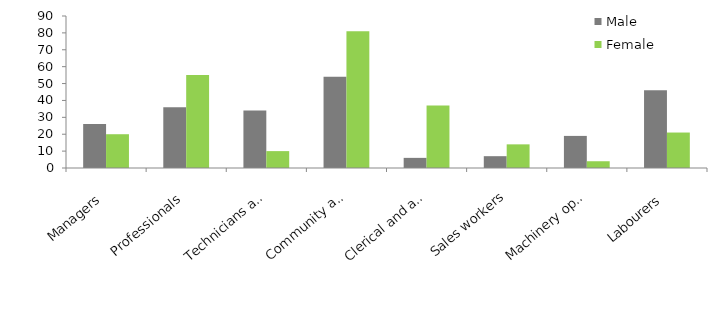
| Category | Male | Female |
|---|---|---|
| Managers | 26 | 20 |
| Professionals | 36 | 55 |
| Technicians and trades workers | 34 | 10 |
| Community and personal service workers | 54 | 81 |
| Clerical and administrative workers | 6 | 37 |
| Sales workers | 7 | 14 |
| Machinery operators and drivers | 19 | 4 |
| Labourers | 46 | 21 |